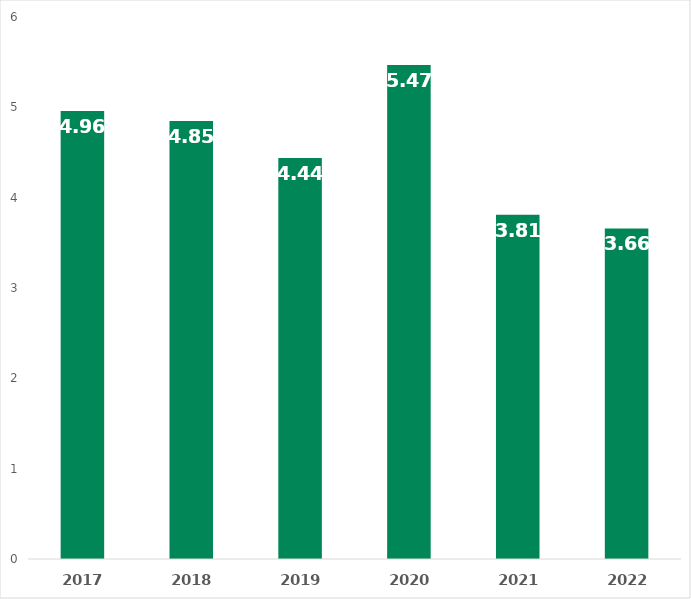
| Category |  Average Length of Stay, days With Covid-19 |  Average Length of Stay, days Without Covid-19 |
|---|---|---|
| 2017.0 | 4.96 |  |
| 2018.0 | 4.85 |  |
| 2019.0 | 4.44 |  |
| 2020.0 | 5.47 |  |
| 2021.0 | 3.81 |  |
| 2022.0 | 3.66 |  |